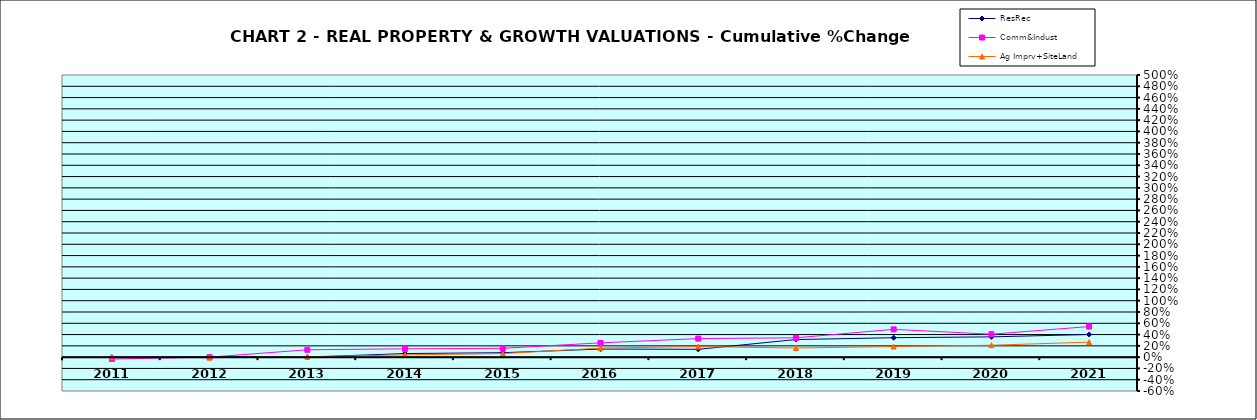
| Category | ResRec | Comm&Indust | Ag Imprv+SiteLand |
|---|---|---|---|
| 2011.0 | -0.003 | -0.034 | 0 |
| 2012.0 | 0.003 | 0 | -0.009 |
| 2013.0 | 0 | 0.131 | 0.007 |
| 2014.0 | 0.064 | 0.148 | 0.04 |
| 2015.0 | 0.079 | 0.157 | 0.063 |
| 2016.0 | 0.143 | 0.253 | 0.161 |
| 2017.0 | 0.139 | 0.329 | 0.188 |
| 2018.0 | 0.312 | 0.343 | 0.162 |
| 2019.0 | 0.344 | 0.493 | 0.188 |
| 2020.0 | 0.359 | 0.406 | 0.211 |
| 2021.0 | 0.402 | 0.542 | 0.266 |